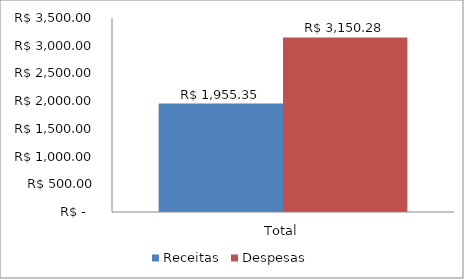
| Category | Receitas | Despesas |
|---|---|---|
| Total | 1955.35 | 3150.28 |